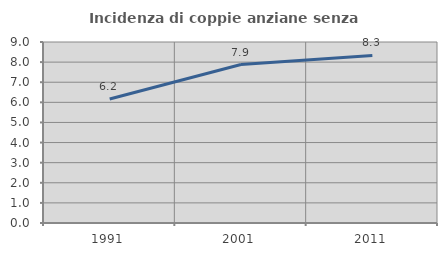
| Category | Incidenza di coppie anziane senza figli  |
|---|---|
| 1991.0 | 6.166 |
| 2001.0 | 7.88 |
| 2011.0 | 8.333 |